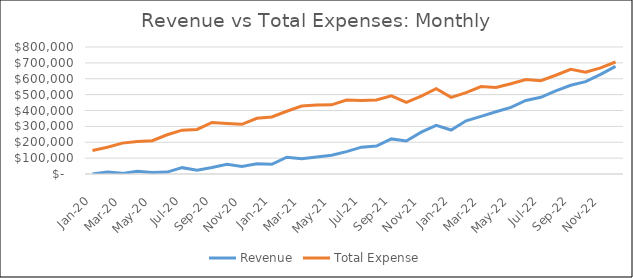
| Category | Revenue | Total Expense |
|---|---|---|
| 2020-01-01 | 0 | 148367.5 |
| 2020-02-29 | 13000 | 168575 |
| 2020-03-31 | 4000 | 194535 |
| 2020-04-30 | 18000 | 204613.75 |
| 2020-05-31 | 10000 | 209507.5 |
| 2020-06-30 | 12000 | 247112.5 |
| 2020-07-31 | 40000 | 276065.625 |
| 2020-08-31 | 24000 | 280845.625 |
| 2020-09-30 | 41000 | 324681.875 |
| 2020-10-31 | 61000 | 317969.375 |
| 2020-11-30 | 47000 | 312933.125 |
| 2020-12-31 | 65000 | 350736.875 |
| 2021-01-31 | 61000 | 359316.9 |
| 2021-02-28 | 106000 | 395345.825 |
| 2021-03-31 | 96000 | 428034.275 |
| 2021-04-30 | 107000 | 433869.988 |
| 2021-05-31 | 118000 | 435624.35 |
| 2021-06-30 | 141000 | 465690.3 |
| 2021-07-31 | 169000 | 462669.094 |
| 2021-08-31 | 176000 | 466205.344 |
| 2021-09-30 | 221000 | 492209.231 |
| 2021-10-31 | 208000 | 450695.856 |
| 2021-11-30 | 264000 | 490062.919 |
| 2021-12-31 | 306000 | 537649.981 |
| 2022-01-31 | 277000 | 482575.931 |
| 2022-02-28 | 335000 | 512409.281 |
| 2022-03-31 | 363000 | 551104.756 |
| 2022-04-30 | 392000 | 544501.719 |
| 2022-05-31 | 420000 | 568137.431 |
| 2022-06-30 | 463000 | 595047.431 |
| 2022-07-31 | 483000 | 587916.994 |
| 2022-08-31 | 524000 | 622103.381 |
| 2022-09-30 | 559000 | 659418.519 |
| 2022-10-31 | 582000 | 641661.019 |
| 2022-11-30 | 628000 | 668646.731 |
| 2022-12-31 | 678000 | 705413.694 |